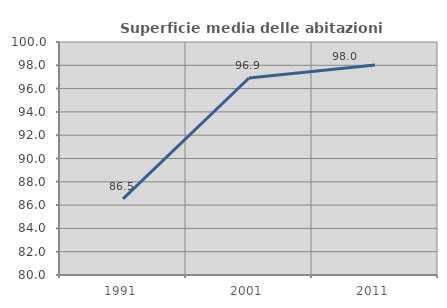
| Category | Superficie media delle abitazioni occupate |
|---|---|
| 1991.0 | 86.534 |
| 2001.0 | 96.911 |
| 2011.0 | 98.029 |